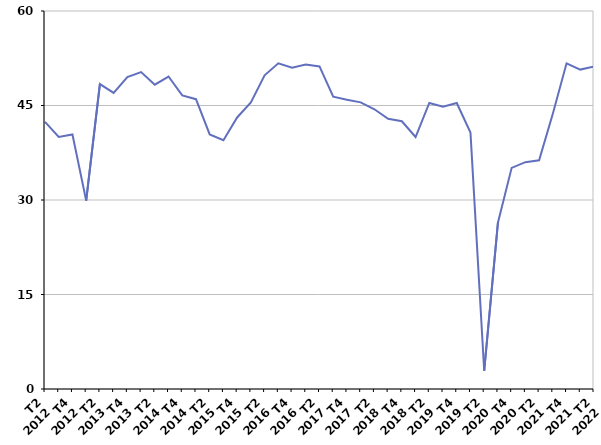
| Category | Radiation administrative |
|---|---|
| T2
2012 | 42.4 |
| T3
2012 | 40 |
| T4
2012 | 40.4 |
| T1
2013 | 29.9 |
| T2
2013 | 48.4 |
| T3
2013 | 47 |
| T4
2013 | 49.5 |
| T1
2014 | 50.3 |
| T2
2014 | 48.3 |
| T3
2014 | 49.6 |
| T4
2014 | 46.6 |
| T1
2015 | 46 |
| T2
2015 | 40.4 |
| T3
2015 | 39.5 |
| T4
2015 | 43.1 |
| T1
2016 | 45.5 |
| T2
2016 | 49.8 |
| T3
2016 | 51.7 |
| T4
2016 | 51 |
| T1
2017 | 51.5 |
| T2
2017 | 51.2 |
| T3
2017 | 46.4 |
| T4
2017 | 45.9 |
| T1
2018 | 45.5 |
| T2
2018 | 44.4 |
| T3
2018 | 42.9 |
| T4
2018 | 42.5 |
| T1
2019 | 40 |
| T2
2019 | 45.4 |
| T3
2019 | 44.8 |
| T4
2019 | 45.4 |
| T1
2020 | 40.7 |
| T2
2020 | 2.9 |
| T3
2020 | 26.4 |
| T4
2020 | 35.1 |
| T1
2021 | 36 |
| T2
2021 | 36.3 |
| T3
2021 | 43.7 |
| T4
2021 | 51.7 |
| T1
2022 | 50.7 |
| T2
2022 | 51.2 |